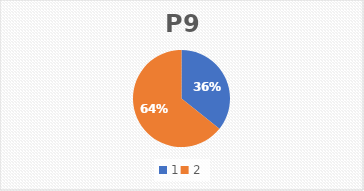
| Category | P9 |
|---|---|
| 0 | 10 |
| 1 | 18 |